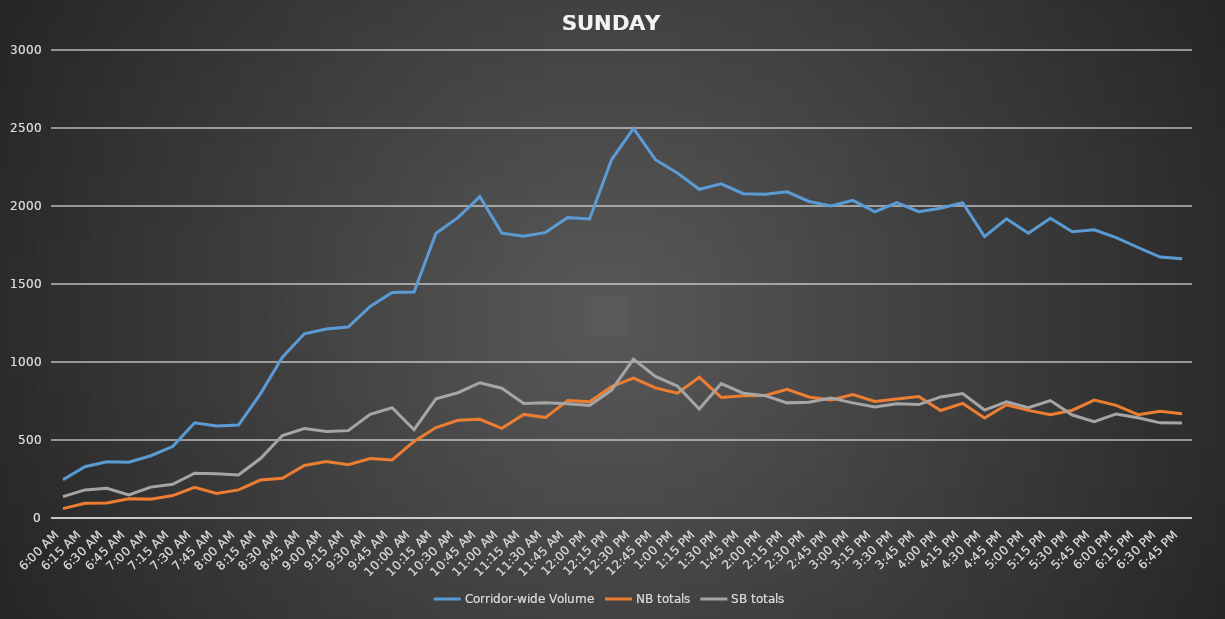
| Category | Corridor-wide Volume | NB totals | SB totals |
|---|---|---|---|
| 6:00 AM | 245 | 60 | 137 |
| 6:15 AM | 329 | 94 | 180 |
| 6:30 AM | 361 | 96 | 190 |
| 6:45 AM | 358 | 124 | 148 |
| 7:00 AM | 399 | 121 | 198 |
| 7:15 AM | 458 | 144 | 216 |
| 7:30 AM | 610 | 197 | 287 |
| 7:45 AM | 590 | 157 | 283 |
| 8:00 AM | 596 | 180 | 276 |
| 8:15 AM | 796 | 243 | 381 |
| 8:30 AM | 1031 | 255 | 529 |
| 8:45 AM | 1181 | 337 | 573 |
| 9:00 AM | 1212 | 362 | 554 |
| 9:15 AM | 1224 | 341 | 560 |
| 9:30 AM | 1356 | 381 | 664 |
| 9:45 AM | 1445 | 372 | 707 |
| 10:00 AM | 1449 | 491 | 566 |
| 10:15 AM | 1825 | 580 | 764 |
| 10:30 AM | 1925 | 626 | 803 |
| 10:45 AM | 2060 | 633 | 867 |
| 11:00 AM | 1826 | 575 | 832 |
| 11:15 AM | 1806 | 664 | 734 |
| 11:30 AM | 1831 | 645 | 739 |
| 11:45 AM | 1926 | 753 | 732 |
| 12:00 PM | 1917 | 745 | 721 |
| 12:15 PM | 2296 | 843 | 820 |
| 12:30 PM | 2498 | 897 | 1018 |
| 12:45 PM | 2297 | 834 | 908 |
| 1:00 PM | 2212 | 800 | 846 |
| 1:15 PM | 2107 | 902 | 699 |
| 1:30 PM | 2142 | 773 | 862 |
| 1:45 PM | 2079 | 783 | 800 |
| 2:00 PM | 2076 | 786 | 784 |
| 2:15 PM | 2091 | 825 | 738 |
| 2:30 PM | 2029 | 776 | 742 |
| 2:45 PM | 2000 | 756 | 769 |
| 3:00 PM | 2036 | 792 | 738 |
| 3:15 PM | 1963 | 747 | 712 |
| 3:30 PM | 2022 | 763 | 732 |
| 3:45 PM | 1964 | 779 | 727 |
| 4:00 PM | 1986 | 689 | 776 |
| 4:15 PM | 2021 | 735 | 798 |
| 4:30 PM | 1804 | 641 | 692 |
| 4:45 PM | 1918 | 726 | 745 |
| 5:00 PM | 1825 | 690 | 707 |
| 5:15 PM | 1921 | 662 | 753 |
| 5:30 PM | 1835 | 691 | 660 |
| 5:45 PM | 1847 | 756 | 617 |
| 6:00 PM | 1797 | 722 | 667 |
| 6:15 PM | 1734 | 662 | 643 |
| 6:30 PM | 1673 | 684 | 610 |
| 6:45 PM | 1662 | 669 | 609 |